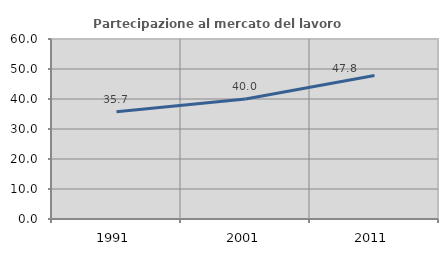
| Category | Partecipazione al mercato del lavoro  femminile |
|---|---|
| 1991.0 | 35.714 |
| 2001.0 | 40.025 |
| 2011.0 | 47.826 |